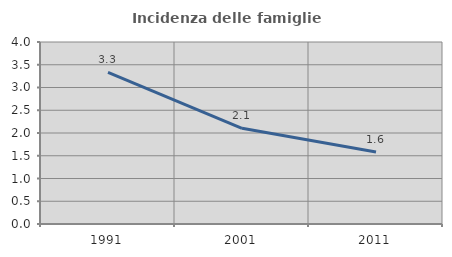
| Category | Incidenza delle famiglie numerose |
|---|---|
| 1991.0 | 3.333 |
| 2001.0 | 2.102 |
| 2011.0 | 1.582 |